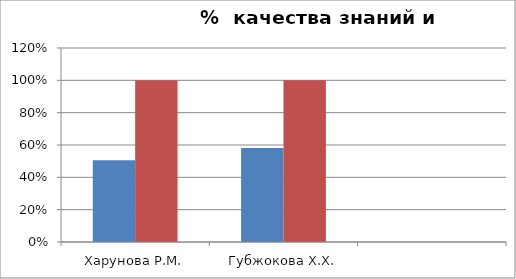
| Category | Series 0 | 2 |
|---|---|---|
| Харунова Р.М. | 0.506 | 1 |
| Губжокова Х.Х. | 0.581 | 1 |